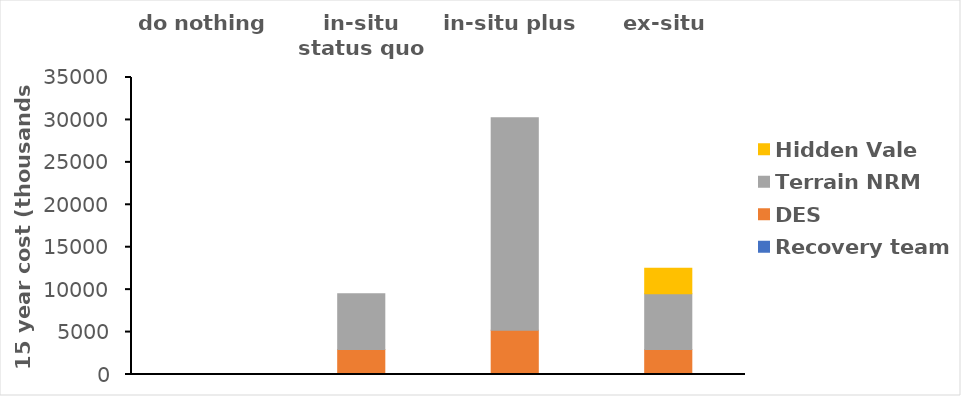
| Category | Recovery team | DES | Terrain NRM | Hidden Vale |
|---|---|---|---|---|
| do nothing | 0 | 0 | 0 | 0 |
| in-situ status quo | 0 | 2951.087 | 6568.602 | 0 |
| in-situ plus | 0 | 5228.866 | 25024.609 | 0 |
| ex-situ | 0 | 2951.087 | 6568.602 | 3000.943 |